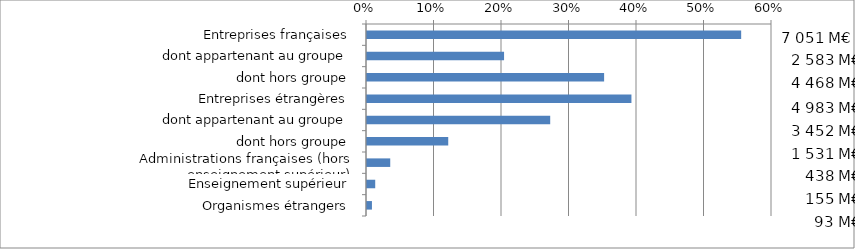
| Category | Series 0 |
|---|---|
| Entreprises françaises | 0.554 |
| dont appartenant au groupe | 0.203 |
| dont hors groupe | 0.351 |
| Entreprises étrangères | 0.392 |
| dont appartenant au groupe | 0.271 |
| dont hors groupe | 0.12 |
| Administrations françaises (hors enseignement supérieur) | 0.034 |
| Enseignement supérieur | 0.012 |
| Organismes étrangers | 0.007 |